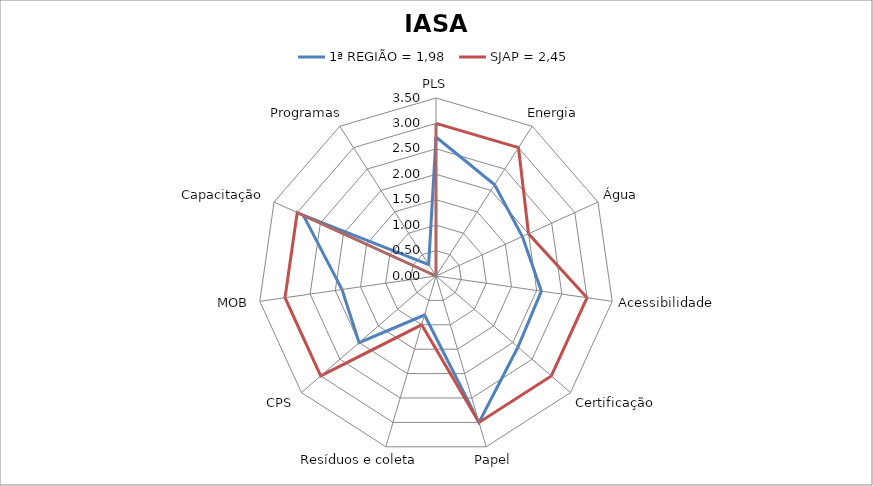
| Category | 1ª REGIÃO = 1,98 | SJAP = 2,45 |
|---|---|---|
| PLS | 2.733 | 3 |
| Energia | 2.133 | 3 |
| Água | 1.867 | 2 |
| Acessibilidade | 2.093 | 3 |
| Certificação | 2.133 | 3 |
| Papel | 3 | 3 |
| Resíduos e coleta | 0.8 | 1 |
| CPS | 2 | 3 |
| MOB | 1.867 | 3 |
| Capacitação | 2.867 | 3 |
| Programas | 0.267 | 0 |